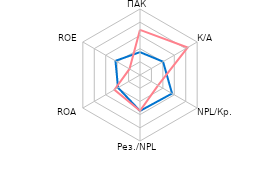
| Category | Србија | Регион |
|---|---|---|
| ПАК | 1.732 | 3.42 |
| К/А | 2.018 | 4.172 |
| NPL/Кр. | 2.804 | 1.582 |
| Рез./NPL | 2.722 | 2.716 |
| ROA | 1.92 | 2.235 |
| ROE | 2.146 | 0.918 |